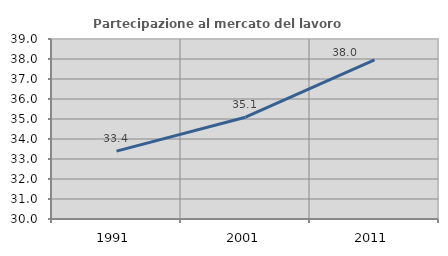
| Category | Partecipazione al mercato del lavoro  femminile |
|---|---|
| 1991.0 | 33.394 |
| 2001.0 | 35.088 |
| 2011.0 | 37.953 |